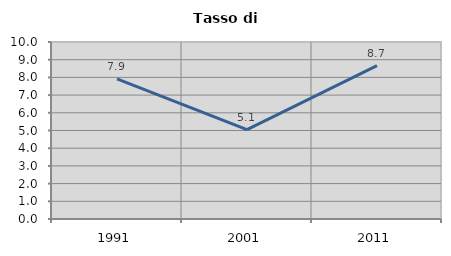
| Category | Tasso di disoccupazione   |
|---|---|
| 1991.0 | 7.918 |
| 2001.0 | 5.053 |
| 2011.0 | 8.664 |